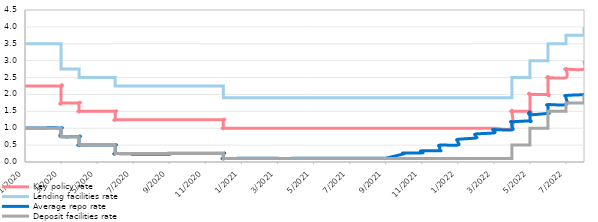
| Category | Key policy rate | Lending facilities rate | Average repo rate | Deposit facilities rate |
|---|---|---|---|---|
| 2020-01-08 | 2.25 | 3.5 | 1.01 | 1 |
| 2020-01-15 | 2.25 | 3.5 | 1.01 | 1 |
| 2020-01-22 | 2.25 | 3.5 | 1.01 | 1 |
| 2020-01-29 | 2.25 | 3.5 | 1.01 | 1 |
| 2020-02-05 | 2.25 | 3.5 | 1.01 | 1 |
| 2020-02-12 | 2.25 | 3.5 | 1.01 | 1 |
| 2020-02-19 | 2.25 | 3.5 | 1.01 | 1 |
| 2020-02-26 | 2.25 | 3.5 | 1.01 | 1 |
| 2020-03-04 | 2.25 | 3.5 | 1.01 | 1 |
| 2020-03-11 | 2.25 | 3.5 | 1 | 1 |
| 2020-03-18 | 1.75 | 2.75 | 0.85 | 0.75 |
| 2020-03-25 | 1.75 | 2.75 | 0.75 | 0.75 |
| 2020-04-01 | 1.75 | 2.75 | 0.75 | 0.75 |
| 2020-04-08 | 1.75 | 2.75 | 0.75 | 0.75 |
| 2020-04-15 | 1.5 | 2.5 | 0.5 | 0.5 |
| 2020-04-22 | 1.5 | 2.5 | 0.5 | 0.5 |
| 2020-04-29 | 1.5 | 2.5 | 0.5 | 0.5 |
| 2020-05-06 | 1.5 | 2.5 | 0.5 | 0.5 |
| 2020-05-13 | 1.5 | 2.5 | 0.5 | 0.5 |
| 2020-05-20 | 1.5 | 2.5 | 0.5 | 0.5 |
| 2020-05-27 | 1.5 | 2.5 | 0.5 | 0.5 |
| 2020-06-03 | 1.5 | 2.5 | 0.5 | 0.5 |
| 2020-06-10 | 1.5 | 2.5 | 0.49 | 0.5 |
| 2020-06-17 | 1.25 | 2.25 | 0.25 | 0.25 |
| 2020-06-24 | 1.25 | 2.25 | 0.25 | 0.25 |
| 2020-07-01 | 1.25 | 2.25 | 0.24 | 0.25 |
| 2020-07-08 | 1.25 | 2.25 | 0.24 | 0.25 |
| 2020-07-15 | 1.25 | 2.25 | 0.23 | 0.25 |
| 2020-07-22 | 1.25 | 2.25 | 0.23 | 0.25 |
| 2020-07-29 | 1.25 | 2.25 | 0.23 | 0.25 |
| 2020-08-05 | 1.25 | 2.25 | 0.23 | 0.25 |
| 2020-08-12 | 1.25 | 2.25 | 0.23 | 0.25 |
| 2020-08-19 | 1.25 | 2.25 | 0.23 | 0.25 |
| 2020-08-26 | 1.25 | 2.25 | 0.23 | 0.25 |
| 2020-09-02 | 1.25 | 2.25 | 0.23 | 0.25 |
| 2020-09-09 | 1.25 | 2.25 | 0.24 | 0.25 |
| 2020-09-16 | 1.25 | 2.25 | 0.25 | 0.25 |
| 2020-09-23 | 1.25 | 2.25 | 0.25 | 0.25 |
| 2020-09-30 | 1.25 | 2.25 | 0.26 | 0.25 |
| 2020-10-07 | 1.25 | 2.25 | 0.26 | 0.25 |
| 2020-10-14 | 1.25 | 2.25 | 0.26 | 0.25 |
| 2020-10-21 | 1.25 | 2.25 | 0.26 | 0.25 |
| 2020-10-28 | 1.25 | 2.25 | 0.26 | 0.25 |
| 2020-11-04 | 1.25 | 2.25 | 0.26 | 0.25 |
| 2020-11-10 | 1.25 | 2.25 | 0.26 | 0.25 |
| 2020-11-18 | 1.25 | 2.25 | 0.26 | 0.25 |
| 2020-11-26 | 1.25 | 2.25 | 0.26 | 0.25 |
| 2020-12-02 | 1.25 | 2.25 | 0.26 | 0.25 |
| 2020-12-09 | 1.25 | 2.25 | 0.25 | 0.25 |
| 2020-12-16 | 1 | 1.9 | 0.1 | 0.1 |
| 2020-12-23 | 1 | 1.9 | 0.1 | 0.1 |
| 2020-12-30 | 1 | 1.9 | 0.1 | 0.1 |
| 2021-01-06 | 1 | 1.9 | 0.11 | 0.1 |
| 2021-01-13 | 1 | 1.9 | 0.11 | 0.1 |
| 2021-01-20 | 1 | 1.9 | 0.11 | 0.1 |
| 2021-01-27 | 1 | 1.9 | 0.11 | 0.1 |
| 2021-02-03 | 1 | 1.9 | 0.11 | 0.1 |
| 2021-02-10 | 1 | 1.9 | 0.11 | 0.1 |
| 2021-02-17 | 1 | 1.9 | 0.1 | 0.1 |
| 2021-02-24 | 1 | 1.9 | 0.11 | 0.1 |
| 2021-03-03 | 1 | 1.9 | 0.11 | 0.1 |
| 2021-03-10 | 1 | 1.9 | 0.11 | 0.1 |
| 2021-03-17 | 1 | 1.9 | 0.11 | 0.1 |
| 2021-03-24 | 1 | 1.9 | 0.11 | 0.1 |
| 2021-03-31 | 1 | 1.9 | 0.1 | 0.1 |
| 2021-04-07 | 1 | 1.9 | 0.11 | 0.1 |
| 2021-04-14 | 1 | 1.9 | 0.11 | 0.1 |
| 2021-04-21 | 1 | 1.9 | 0.11 | 0.1 |
| 2021-04-28 | 1 | 1.9 | 0.11 | 0.1 |
| 2021-05-05 | 1 | 1.9 | 0.11 | 0.1 |
| 2021-05-12 | 1 | 1.9 | 0.11 | 0.1 |
| 2021-05-19 | 1 | 1.9 | 0.11 | 0.1 |
| 2021-05-26 | 1 | 1.9 | 0.11 | 0.1 |
| 2021-06-02 | 1 | 1.9 | 0.11 | 0.1 |
| 2021-06-09 | 1 | 1.9 | 0.11 | 0.1 |
| 2021-06-16 | 1 | 1.9 | 0.11 | 0.1 |
| 2021-06-23 | 1 | 1.9 | 0.11 | 0.1 |
| 2021-06-30 | 1 | 1.9 | 0.11 | 0.1 |
| 2021-07-07 | 1 | 1.9 | 0.11 | 0.1 |
| 2021-07-14 | 1 | 1.9 | 0.11 | 0.1 |
| 2021-07-21 | 1 | 1.9 | 0.11 | 0.1 |
| 2021-07-28 | 1 | 1.9 | 0.11 | 0.1 |
| 2021-08-04 | 1 | 1.9 | 0.11 | 0.1 |
| 2021-08-11 | 1 | 1.9 | 0.11 | 0.1 |
| 2021-08-18 | 1 | 1.9 | 0.11 | 0.1 |
| 2021-08-25 | 1 | 1.9 | 0.11 | 0.1 |
| 2021-09-01 | 1 | 1.9 | 0.11 | 0.1 |
| 2021-09-08 | 1 | 1.9 | 0.11 | 0.1 |
| 2021-09-15 | 1 | 1.9 | 0.11 | 0.1 |
| 2021-09-22 | 1 | 1.9 | 0.11 | 0.1 |
| 2021-09-29 | 1 | 1.9 | 0.11 | 0.1 |
| 2021-10-06 | 1 | 1.9 | 0.24 | 0.1 |
| 2021-10-13 | 1 | 1.9 | 0.25 | 0.1 |
| 2021-10-20 | 1 | 1.9 | 0.26 | 0.1 |
| 2021-10-27 | 1 | 1.9 | 0.27 | 0.1 |
| 2021-11-03 | 1 | 1.9 | 0.27 | 0.1 |
| 2021-11-10 | 1 | 1.9 | 0.28 | 0.1 |
| 2021-11-17 | 1 | 1.9 | 0.3 | 0.1 |
| 2021-11-24 | 1 | 1.9 | 0.33 | 0.1 |
| 2021-12-01 | 1 | 1.9 | 0.33 | 0.1 |
| 2021-12-08 | 1 | 1.9 | 0.34 | 0.1 |
| 2021-12-15 | 1 | 1.9 | 0.39 | 0.1 |
| 2021-12-22 | 1 | 1.9 | 0.44 | 0.1 |
| 2021-12-29 | 1 | 1.9 | 0.5 | 0.1 |
| 2022-01-05 | 1 | 1.9 | 0.5 | 0.1 |
| 2022-01-12 | 1 | 1.9 | 0.59 | 0.1 |
| 2022-01-19 | 1 | 1.9 | 0.63 | 0.1 |
| 2022-01-26 | 1 | 1.9 | 0.67 | 0.1 |
| 2022-02-02 | 1 | 1.9 | 0.71 | 0.1 |
| 2022-02-09 | 1 | 1.9 | 0.75 | 0.1 |
| 2022-02-16 | 1 | 1.9 | 0.79 | 0.1 |
| 2022-02-23 | 1 | 1.9 | 0.83 | 0.1 |
| 2022-03-02 | 1 | 1.9 | 0.86 | 0.1 |
| 2022-03-09 | 1 | 1.9 | 0.9 | 0.1 |
| 2022-03-16 | 1 | 1.9 | 0.93 | 0.1 |
| 2022-03-23 | 1 | 1.9 | 0.95 | 0.1 |
| 2022-03-30 | 1 | 1.9 | 0.96 | 0.1 |
| 2022-04-06 | 1 | 1.9 | 0.95 | 0.1 |
| 2022-04-13 | 1.5 | 2.5 | 1.05 | 0.5 |
| 2022-04-20 | 1.5 | 2.5 | 1.19 | 0.5 |
| 2022-04-27 | 1.5 | 2.5 | 1.19 | 0.5 |
| 2022-05-04 | 1.5 | 2.5 | 1.22 | 0.5 |
| 2022-05-11 | 1.5 | 2.5 | 1.21 | 0.5 |
| 2022-05-18 | 2 | 3 | 1.48 | 1 |
| 2022-05-25 | 2 | 3 | 1.4 | 1 |
| 2022-06-01 | 2 | 3 | 1.44 | 1 |
| 2022-06-08 | 2 | 3 | 1.45 | 1 |
| 2022-06-15 | 2.5 | 3.5 | 1.63 | 1.5 |
| 2022-06-22 | 2.5 | 3.5 | 1.66 | 1.5 |
| 2022-06-29 | 2.5 | 3.5 | 1.7 | 1.5 |
| 2022-07-06 | 2.5 | 3.5 | 1.7 | 1.5 |
| 2022-07-13 | 2.75 | 3.75 | 1.9 | 1.75 |
| 2022-07-20 | 2.75 | 3.75 | 1.95 | 1.75 |
| 2022-07-27 | 2.75 | 3.75 | 1.97 | 1.75 |
| 2022-08-03 | 2.75 | 3.75 | 1.99 | 1.75 |
| 2022-08-11 | 3 | 4 | 1.97 | 2 |